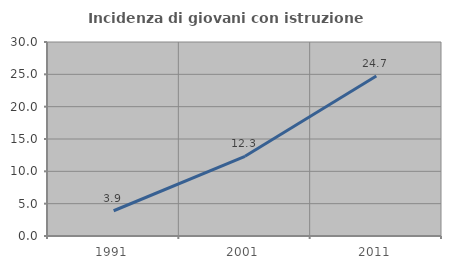
| Category | Incidenza di giovani con istruzione universitaria |
|---|---|
| 1991.0 | 3.906 |
| 2001.0 | 12.323 |
| 2011.0 | 24.734 |